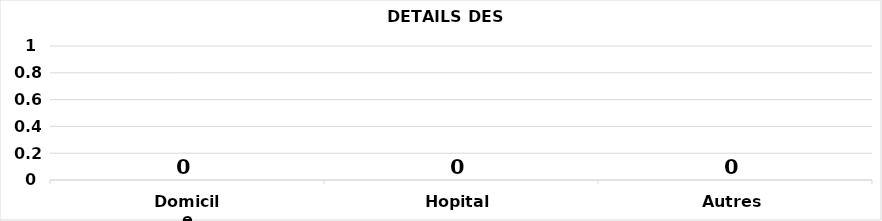
| Category | Series 0 |
|---|---|
| Domicile | 0 |
| Hopital | 0 |
| Autres | 0 |